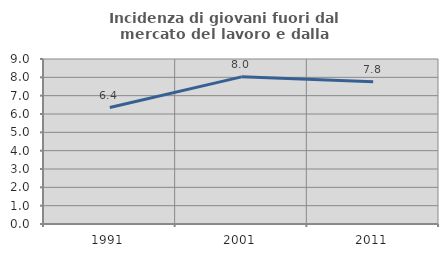
| Category | Incidenza di giovani fuori dal mercato del lavoro e dalla formazione  |
|---|---|
| 1991.0 | 6.353 |
| 2001.0 | 8.026 |
| 2011.0 | 7.757 |